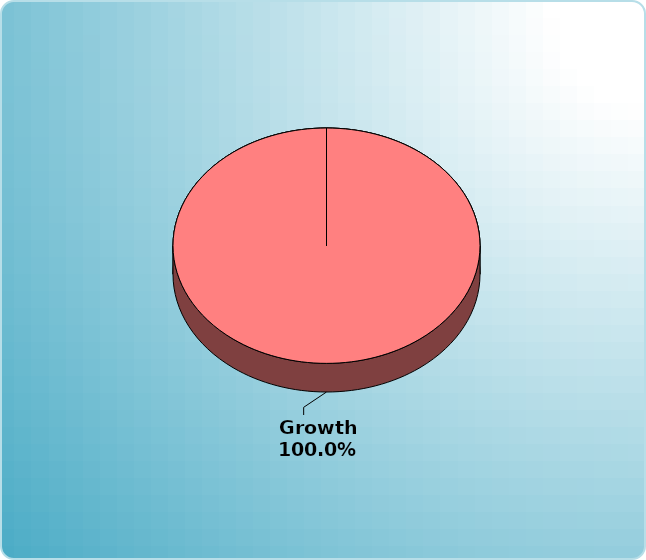
| Category | Series 0 |
|---|---|
| Cash | 0 |
| Bonds | 0 |
| Muni Bond | 0 |
| Hybrid bond | 0 |
| Value | 0 |
| Growth | 50000 |
| Small-Cap | 0 |
| Tangibles | 0 |
| International | 0 |
| Personal Property | 0 |
| Miscellaneous | 0 |